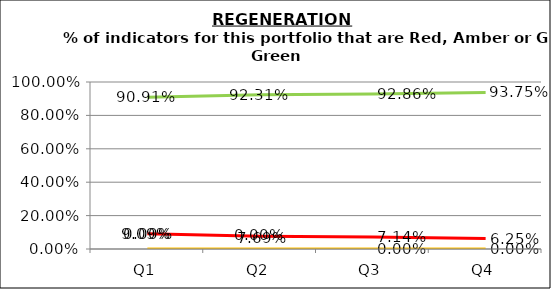
| Category | Green | Amber | Red |
|---|---|---|---|
| Q1 | 0.909 | 0 | 0.091 |
| Q2 | 0.923 | 0 | 0.077 |
| Q3 | 0.929 | 0 | 0.071 |
| Q4 | 0.938 | 0 | 0.062 |